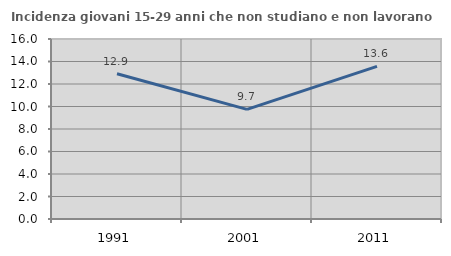
| Category | Incidenza giovani 15-29 anni che non studiano e non lavorano  |
|---|---|
| 1991.0 | 12.914 |
| 2001.0 | 9.744 |
| 2011.0 | 13.561 |